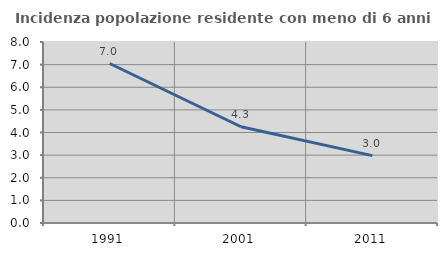
| Category | Incidenza popolazione residente con meno di 6 anni |
|---|---|
| 1991.0 | 7.049 |
| 2001.0 | 4.253 |
| 2011.0 | 2.977 |